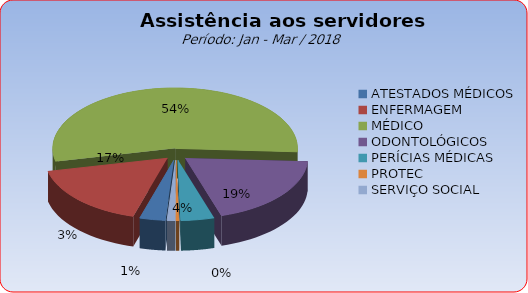
| Category | Series 0 |
|---|---|
| ATESTADOS MÉDICOS | 3.4 |
| ENFERMAGEM | 16.998 |
| MÉDICO | 54.395 |
| ODONTOLÓGICOS | 19.32 |
| PERÍCIAS MÉDICAS | 4.395 |
| PROTEC | 0.415 |
| SERVIÇO SOCIAL | 1.078 |